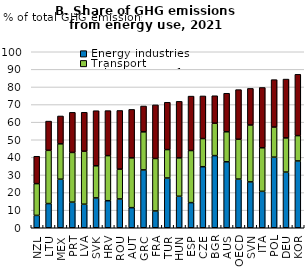
| Category | Energy industries | Transport | Other source of energy use |
|---|---|---|---|
| NZL | 7.028 | 18.036 | 15.561 |
| LTU | 13.748 | 30.245 | 16.616 |
| MEX | 27.598 | 20.083 | 15.838 |
| PRT | 14.56 | 28.237 | 22.784 |
| LVA | 13.395 | 30.096 | 22.135 |
| SVK | 16.962 | 18.247 | 31.296 |
| HRV | 15.367 | 25.615 | 25.581 |
| ROU | 16.367 | 16.947 | 33.331 |
| AUT | 11.421 | 28.288 | 27.544 |
| GRC | 32.873 | 21.618 | 14.678 |
| FRA | 9.553 | 29.81 | 30.455 |
| TUR | 28.262 | 16.159 | 26.892 |
| HUN | 17.904 | 21.794 | 32.14 |
| ESP | 14.28 | 29.601 | 30.916 |
| CZE | 34.679 | 15.997 | 24.219 |
| BGR | 40.99 | 18.401 | 15.621 |
| AUS | 37.47 | 17.061 | 21.897 |
| OECD | 27.663 | 22.63 | 28.193 |
| SVN | 26.066 | 32.319 | 20.795 |
| ITA | 20.697 | 24.732 | 34.274 |
| POL | 40.112 | 17.112 | 26.937 |
| DEU | 31.625 | 19.416 | 33.439 |
| KOR | 37.958 | 14.399 | 34.83 |